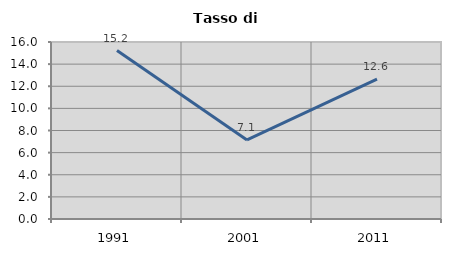
| Category | Tasso di disoccupazione   |
|---|---|
| 1991.0 | 15.222 |
| 2001.0 | 7.145 |
| 2011.0 | 12.647 |